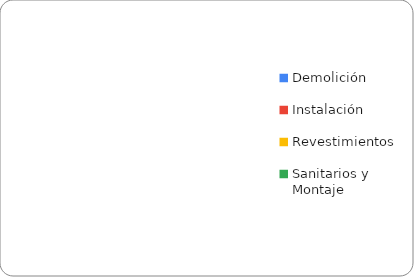
| Category | Partidas |
|---|---|
| Demolición | 0 |
| Instalación | 0 |
| Revestimientos | 0 |
| Sanitarios y Montaje | 0 |